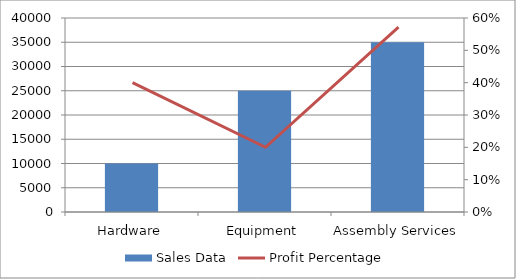
| Category | Sales Data |
|---|---|
| Hardware | 10000 |
| Equipment | 25000 |
| Assembly Services | 35000 |